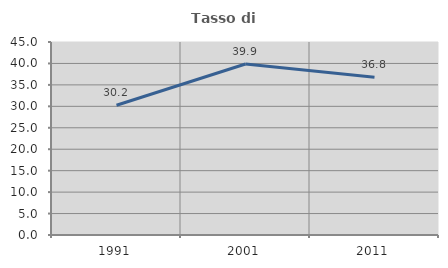
| Category | Tasso di occupazione   |
|---|---|
| 1991.0 | 30.245 |
| 2001.0 | 39.875 |
| 2011.0 | 36.777 |